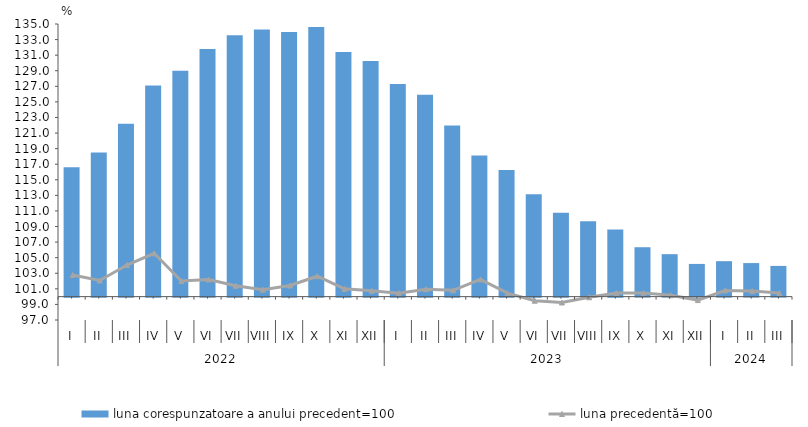
| Category | luna corespunzatoare a anului precedent=100 |
|---|---|
| 0 | 116.6 |
| 1 | 118.5 |
| 2 | 122.2 |
| 3 | 127.1 |
| 4 | 129 |
| 5 | 131.8 |
| 6 | 133.55 |
| 7 | 134.29 |
| 8 | 133.97 |
| 9 | 134.62 |
| 10 | 131.4 |
| 11 | 130.24 |
| 12 | 127.307 |
| 13 | 125.905 |
| 14 | 121.977 |
| 15 | 118.102 |
| 16 | 116.262 |
| 17 | 113.152 |
| 18 | 110.755 |
| 19 | 109.689 |
| 20 | 108.634 |
| 21 | 106.342 |
| 22 | 105.453 |
| 23 | 104.199 |
| 24 | 104.552 |
| 25 | 104.308 |
| 26 | 103.944 |